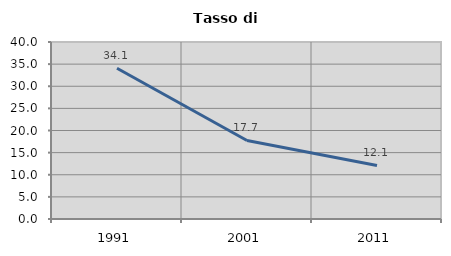
| Category | Tasso di disoccupazione   |
|---|---|
| 1991.0 | 34.058 |
| 2001.0 | 17.746 |
| 2011.0 | 12.102 |